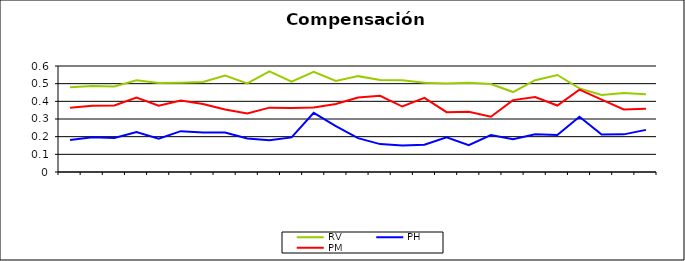
| Category | RV | PH | PM |
|---|---|---|---|
| 0 | 0.479 | 0.181 | 0.364 |
| 1 | 0.487 | 0.196 | 0.375 |
| 2 | 0.484 | 0.192 | 0.376 |
| 3 | 0.52 | 0.226 | 0.421 |
| 4 | 0.504 | 0.189 | 0.375 |
| 5 | 0.506 | 0.231 | 0.404 |
| 6 | 0.51 | 0.224 | 0.384 |
| 7 | 0.546 | 0.223 | 0.353 |
| 8 | 0.501 | 0.19 | 0.331 |
| 9 | 0.57 | 0.18 | 0.364 |
| 10 | 0.511 | 0.196 | 0.363 |
| 11 | 0.567 | 0.335 | 0.365 |
| 12 | 0.515 | 0.26 | 0.385 |
| 13 | 0.543 | 0.192 | 0.422 |
| 14 | 0.52 | 0.158 | 0.431 |
| 15 | 0.519 | 0.15 | 0.371 |
| 16 | 0.505 | 0.154 | 0.42 |
| 17 | 0.501 | 0.196 | 0.339 |
| 18 | 0.506 | 0.151 | 0.341 |
| 19 | 0.498 | 0.209 | 0.313 |
| 20 | 0.453 | 0.186 | 0.407 |
| 21 | 0.52 | 0.213 | 0.424 |
| 22 | 0.549 | 0.21 | 0.376 |
| 23 | 0.473 | 0.312 | 0.466 |
| 24 | 0.436 | 0.212 | 0.41 |
| 25 | 0.447 | 0.213 | 0.354 |
| 26 | 0.44 | 0.238 | 0.358 |